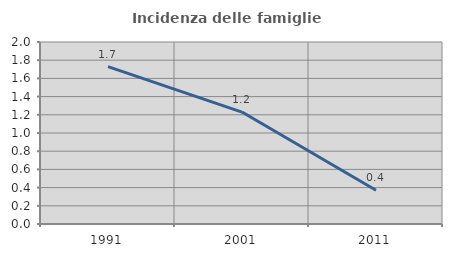
| Category | Incidenza delle famiglie numerose |
|---|---|
| 1991.0 | 1.73 |
| 2001.0 | 1.23 |
| 2011.0 | 0.371 |